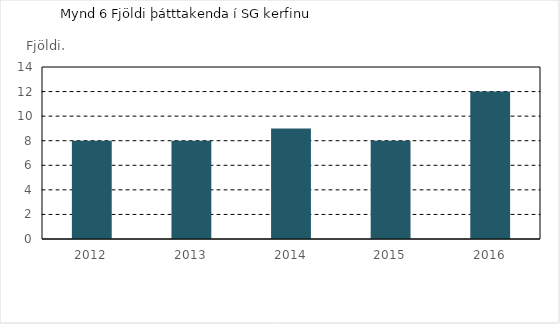
| Category | Series 0 |
|---|---|
| 2012.0 | 8 |
| 2013.0 | 8 |
| 2014.0 | 9 |
| 2015.0 | 8 |
| 2016.0 | 12 |